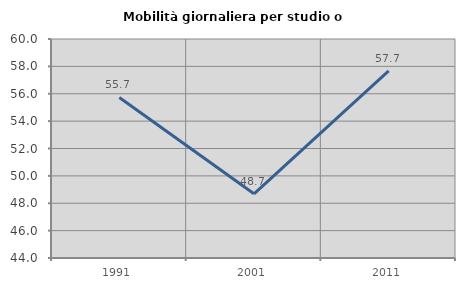
| Category | Mobilità giornaliera per studio o lavoro |
|---|---|
| 1991.0 | 55.732 |
| 2001.0 | 48.69 |
| 2011.0 | 57.671 |